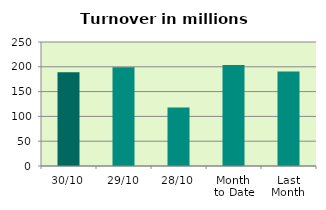
| Category | Series 0 |
|---|---|
| 30/10 | 188.944 |
| 29/10 | 199.275 |
| 28/10 | 118.17 |
| Month 
to Date | 203.501 |
| Last
Month | 190.73 |